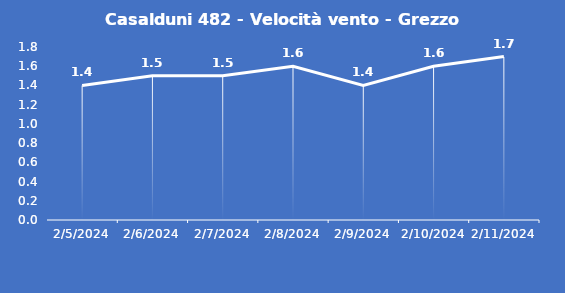
| Category | Casalduni 482 - Velocità vento - Grezzo (m/s) |
|---|---|
| 2/5/24 | 1.4 |
| 2/6/24 | 1.5 |
| 2/7/24 | 1.5 |
| 2/8/24 | 1.6 |
| 2/9/24 | 1.4 |
| 2/10/24 | 1.6 |
| 2/11/24 | 1.7 |